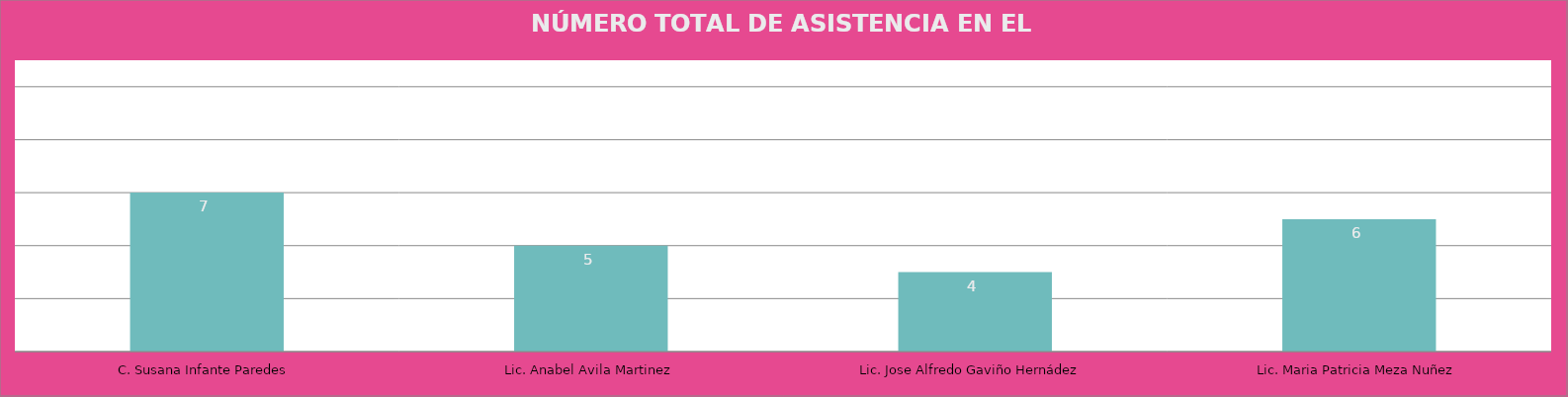
| Category | C. Susana Infante Paredes |
|---|---|
| C. Susana Infante Paredes | 7 |
| Lic. Anabel Avila Martinez | 5 |
| Lic. Jose Alfredo Gaviño Hernádez  | 4 |
| Lic. Maria Patricia Meza Nuñez | 6 |